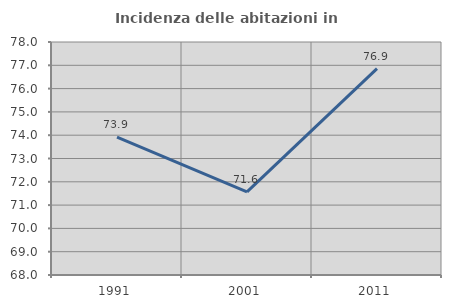
| Category | Incidenza delle abitazioni in proprietà  |
|---|---|
| 1991.0 | 73.913 |
| 2001.0 | 71.569 |
| 2011.0 | 76.86 |